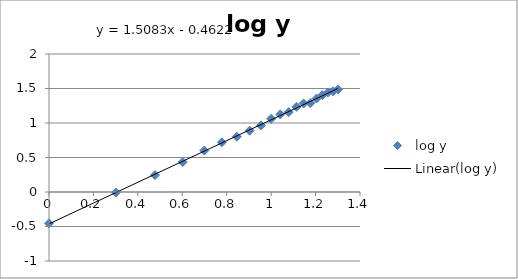
| Category | log y |
|---|---|
| 0.0 | -0.454 |
| 0.3010299956639812 | -0.008 |
| 0.47712125471966244 | 0.246 |
| 0.6020599913279624 | 0.434 |
| 0.6989700043360189 | 0.6 |
| 0.7781512503836436 | 0.721 |
| 0.8450980400142568 | 0.801 |
| 0.9030899869919435 | 0.889 |
| 0.9542425094393249 | 0.965 |
| 1.0 | 1.06 |
| 1.0413926851582251 | 1.125 |
| 1.0791812460476249 | 1.159 |
| 1.1139433523068367 | 1.234 |
| 1.146128035678238 | 1.283 |
| 1.1760912590556813 | 1.289 |
| 1.2041199826559248 | 1.355 |
| 1.2304489213782739 | 1.404 |
| 1.255272505103306 | 1.442 |
| 1.2787536009528289 | 1.459 |
| 1.3010299956639813 | 1.485 |